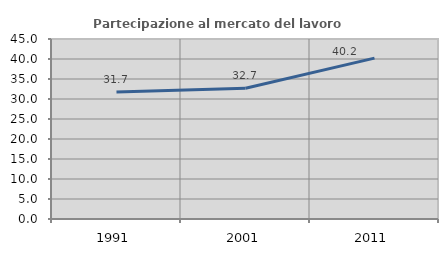
| Category | Partecipazione al mercato del lavoro  femminile |
|---|---|
| 1991.0 | 31.746 |
| 2001.0 | 32.692 |
| 2011.0 | 40.221 |